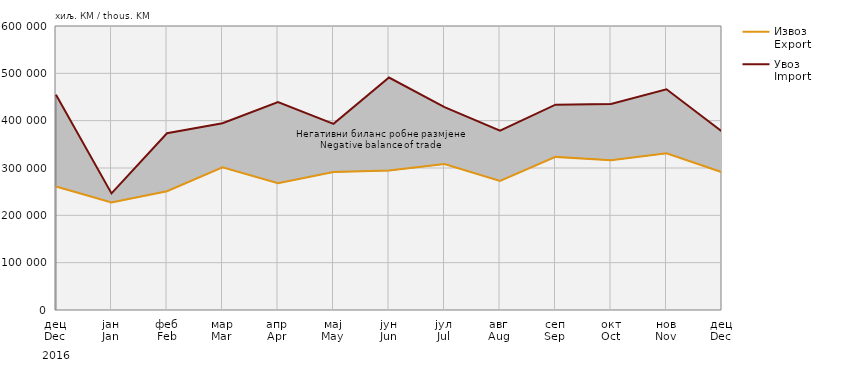
| Category | Извоз
Export | Увоз
Import |
|---|---|---|
| дец
Dec | 260835 | 454746 |
| јан
Jan | 227374 | 246344 |
| феб
Feb | 250969 | 373425 |
| мар
Mar | 301409 | 394461 |
| апр
Apr | 267973 | 439231 |
| мај
May | 291490 | 393257 |
| јун
Jun | 294506 | 491152 |
| јул
Jul | 308275 | 428722 |
| авг
Aug | 272830 | 378735 |
| сеп
Sep | 323479 | 433731 |
| окт
Oct | 316474 | 435293 |
| нов
Nov | 330900 | 466301 |
| дец
Dec | 291210 | 376925 |